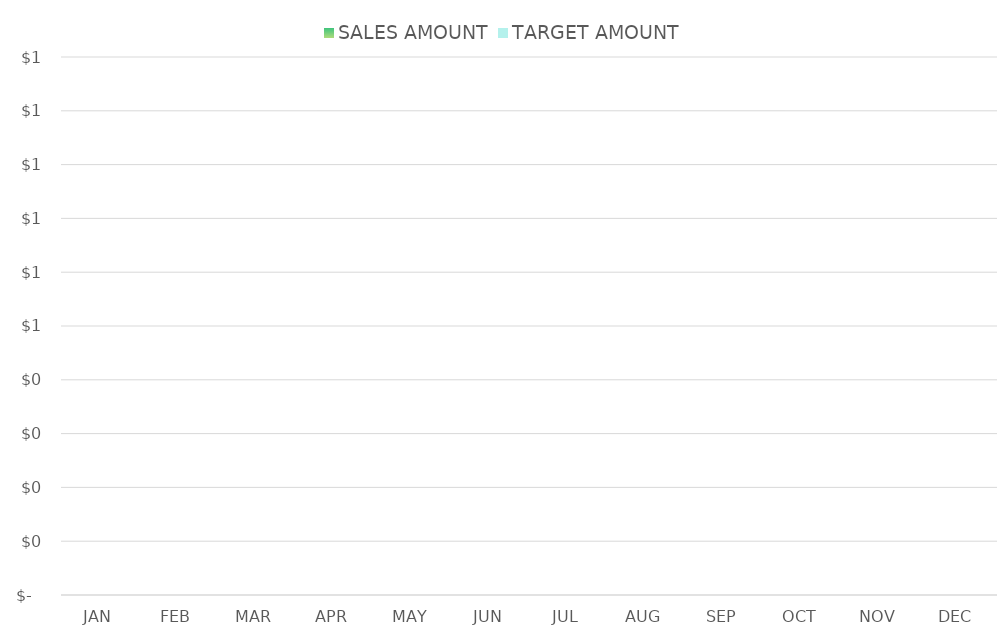
| Category | SALES AMOUNT | TARGET AMOUNT |
|---|---|---|
| JAN | 0 | 0 |
| FEB | 0 | 0 |
| MAR | 0 | 0 |
| APR | 0 | 0 |
| MAY | 0 | 0 |
| JUN | 0 | 0 |
| JUL | 0 | 0 |
| AUG | 0 | 0 |
| SEP | 0 | 0 |
| OCT | 0 | 0 |
| NOV | 0 | 0 |
| DEC | 0 | 0 |